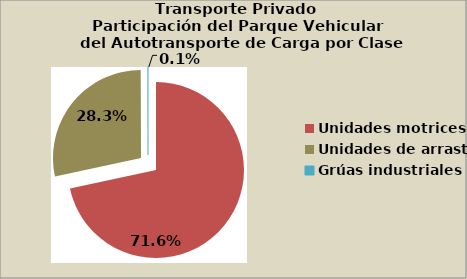
| Category | Series 0 |
|---|---|
| Unidades motrices | 71.62 |
| Unidades de arrastre | 28.327 |
| Grúas industriales | 0.054 |